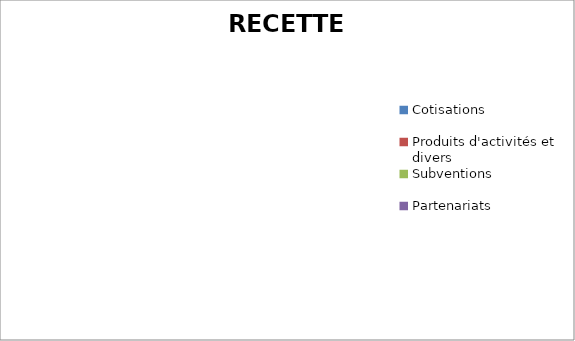
| Category | Series 0 |
|---|---|
| Cotisations | 0 |
| Produits d'activités et divers | 0 |
| Subventions | 0 |
| Partenariats | 0 |